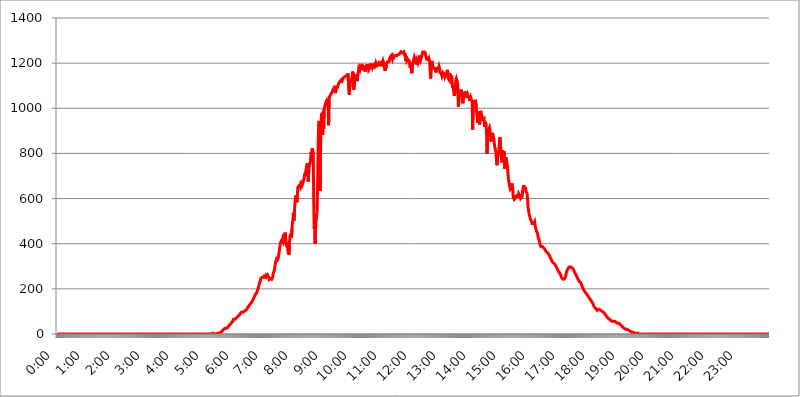
| Category | 2015.04.30. Intenzitás [W/m^2] |
|---|---|
| 0.0 | 0 |
| 0.0006944444444444445 | 0 |
| 0.001388888888888889 | 0 |
| 0.0020833333333333333 | 0 |
| 0.002777777777777778 | 0 |
| 0.003472222222222222 | 0 |
| 0.004166666666666667 | 0 |
| 0.004861111111111111 | 0 |
| 0.005555555555555556 | 0 |
| 0.0062499999999999995 | 0 |
| 0.006944444444444444 | 0 |
| 0.007638888888888889 | 0 |
| 0.008333333333333333 | 0 |
| 0.009027777777777779 | 0 |
| 0.009722222222222222 | 0 |
| 0.010416666666666666 | 0 |
| 0.011111111111111112 | 0 |
| 0.011805555555555555 | 0 |
| 0.012499999999999999 | 0 |
| 0.013194444444444444 | 0 |
| 0.013888888888888888 | 0 |
| 0.014583333333333332 | 0 |
| 0.015277777777777777 | 0 |
| 0.015972222222222224 | 0 |
| 0.016666666666666666 | 0 |
| 0.017361111111111112 | 0 |
| 0.018055555555555557 | 0 |
| 0.01875 | 0 |
| 0.019444444444444445 | 0 |
| 0.02013888888888889 | 0 |
| 0.020833333333333332 | 0 |
| 0.02152777777777778 | 0 |
| 0.022222222222222223 | 0 |
| 0.02291666666666667 | 0 |
| 0.02361111111111111 | 0 |
| 0.024305555555555556 | 0 |
| 0.024999999999999998 | 0 |
| 0.025694444444444447 | 0 |
| 0.02638888888888889 | 0 |
| 0.027083333333333334 | 0 |
| 0.027777777777777776 | 0 |
| 0.02847222222222222 | 0 |
| 0.029166666666666664 | 0 |
| 0.029861111111111113 | 0 |
| 0.030555555555555555 | 0 |
| 0.03125 | 0 |
| 0.03194444444444445 | 0 |
| 0.03263888888888889 | 0 |
| 0.03333333333333333 | 0 |
| 0.034027777777777775 | 0 |
| 0.034722222222222224 | 0 |
| 0.035416666666666666 | 0 |
| 0.036111111111111115 | 0 |
| 0.03680555555555556 | 0 |
| 0.0375 | 0 |
| 0.03819444444444444 | 0 |
| 0.03888888888888889 | 0 |
| 0.03958333333333333 | 0 |
| 0.04027777777777778 | 0 |
| 0.04097222222222222 | 0 |
| 0.041666666666666664 | 0 |
| 0.042361111111111106 | 0 |
| 0.04305555555555556 | 0 |
| 0.043750000000000004 | 0 |
| 0.044444444444444446 | 0 |
| 0.04513888888888889 | 0 |
| 0.04583333333333334 | 0 |
| 0.04652777777777778 | 0 |
| 0.04722222222222222 | 0 |
| 0.04791666666666666 | 0 |
| 0.04861111111111111 | 0 |
| 0.049305555555555554 | 0 |
| 0.049999999999999996 | 0 |
| 0.05069444444444445 | 0 |
| 0.051388888888888894 | 0 |
| 0.052083333333333336 | 0 |
| 0.05277777777777778 | 0 |
| 0.05347222222222222 | 0 |
| 0.05416666666666667 | 0 |
| 0.05486111111111111 | 0 |
| 0.05555555555555555 | 0 |
| 0.05625 | 0 |
| 0.05694444444444444 | 0 |
| 0.057638888888888885 | 0 |
| 0.05833333333333333 | 0 |
| 0.05902777777777778 | 0 |
| 0.059722222222222225 | 0 |
| 0.06041666666666667 | 0 |
| 0.061111111111111116 | 0 |
| 0.06180555555555556 | 0 |
| 0.0625 | 0 |
| 0.06319444444444444 | 0 |
| 0.06388888888888888 | 0 |
| 0.06458333333333334 | 0 |
| 0.06527777777777778 | 0 |
| 0.06597222222222222 | 0 |
| 0.06666666666666667 | 0 |
| 0.06736111111111111 | 0 |
| 0.06805555555555555 | 0 |
| 0.06874999999999999 | 0 |
| 0.06944444444444443 | 0 |
| 0.07013888888888889 | 0 |
| 0.07083333333333333 | 0 |
| 0.07152777777777779 | 0 |
| 0.07222222222222223 | 0 |
| 0.07291666666666667 | 0 |
| 0.07361111111111111 | 0 |
| 0.07430555555555556 | 0 |
| 0.075 | 0 |
| 0.07569444444444444 | 0 |
| 0.0763888888888889 | 0 |
| 0.07708333333333334 | 0 |
| 0.07777777777777778 | 0 |
| 0.07847222222222222 | 0 |
| 0.07916666666666666 | 0 |
| 0.0798611111111111 | 0 |
| 0.08055555555555556 | 0 |
| 0.08125 | 0 |
| 0.08194444444444444 | 0 |
| 0.08263888888888889 | 0 |
| 0.08333333333333333 | 0 |
| 0.08402777777777777 | 0 |
| 0.08472222222222221 | 0 |
| 0.08541666666666665 | 0 |
| 0.08611111111111112 | 0 |
| 0.08680555555555557 | 0 |
| 0.08750000000000001 | 0 |
| 0.08819444444444445 | 0 |
| 0.08888888888888889 | 0 |
| 0.08958333333333333 | 0 |
| 0.09027777777777778 | 0 |
| 0.09097222222222222 | 0 |
| 0.09166666666666667 | 0 |
| 0.09236111111111112 | 0 |
| 0.09305555555555556 | 0 |
| 0.09375 | 0 |
| 0.09444444444444444 | 0 |
| 0.09513888888888888 | 0 |
| 0.09583333333333333 | 0 |
| 0.09652777777777777 | 0 |
| 0.09722222222222222 | 0 |
| 0.09791666666666667 | 0 |
| 0.09861111111111111 | 0 |
| 0.09930555555555555 | 0 |
| 0.09999999999999999 | 0 |
| 0.10069444444444443 | 0 |
| 0.1013888888888889 | 0 |
| 0.10208333333333335 | 0 |
| 0.10277777777777779 | 0 |
| 0.10347222222222223 | 0 |
| 0.10416666666666667 | 0 |
| 0.10486111111111111 | 0 |
| 0.10555555555555556 | 0 |
| 0.10625 | 0 |
| 0.10694444444444444 | 0 |
| 0.1076388888888889 | 0 |
| 0.10833333333333334 | 0 |
| 0.10902777777777778 | 0 |
| 0.10972222222222222 | 0 |
| 0.1111111111111111 | 0 |
| 0.11180555555555556 | 0 |
| 0.11180555555555556 | 0 |
| 0.1125 | 0 |
| 0.11319444444444444 | 0 |
| 0.11388888888888889 | 0 |
| 0.11458333333333333 | 0 |
| 0.11527777777777777 | 0 |
| 0.11597222222222221 | 0 |
| 0.11666666666666665 | 0 |
| 0.1173611111111111 | 0 |
| 0.11805555555555557 | 0 |
| 0.11944444444444445 | 0 |
| 0.12013888888888889 | 0 |
| 0.12083333333333333 | 0 |
| 0.12152777777777778 | 0 |
| 0.12222222222222223 | 0 |
| 0.12291666666666667 | 0 |
| 0.12291666666666667 | 0 |
| 0.12361111111111112 | 0 |
| 0.12430555555555556 | 0 |
| 0.125 | 0 |
| 0.12569444444444444 | 0 |
| 0.12638888888888888 | 0 |
| 0.12708333333333333 | 0 |
| 0.16875 | 0 |
| 0.12847222222222224 | 0 |
| 0.12916666666666668 | 0 |
| 0.12986111111111112 | 0 |
| 0.13055555555555556 | 0 |
| 0.13125 | 0 |
| 0.13194444444444445 | 0 |
| 0.1326388888888889 | 0 |
| 0.13333333333333333 | 0 |
| 0.13402777777777777 | 0 |
| 0.13402777777777777 | 0 |
| 0.13472222222222222 | 0 |
| 0.13541666666666666 | 0 |
| 0.1361111111111111 | 0 |
| 0.13749999999999998 | 0 |
| 0.13819444444444443 | 0 |
| 0.1388888888888889 | 0 |
| 0.13958333333333334 | 0 |
| 0.14027777777777778 | 0 |
| 0.14097222222222222 | 0 |
| 0.14166666666666666 | 0 |
| 0.1423611111111111 | 0 |
| 0.14305555555555557 | 0 |
| 0.14375000000000002 | 0 |
| 0.14444444444444446 | 0 |
| 0.1451388888888889 | 0 |
| 0.1451388888888889 | 0 |
| 0.14652777777777778 | 0 |
| 0.14722222222222223 | 0 |
| 0.14791666666666667 | 0 |
| 0.1486111111111111 | 0 |
| 0.14930555555555555 | 0 |
| 0.15 | 0 |
| 0.15069444444444444 | 0 |
| 0.15138888888888888 | 0 |
| 0.15208333333333332 | 0 |
| 0.15277777777777776 | 0 |
| 0.15347222222222223 | 0 |
| 0.15416666666666667 | 0 |
| 0.15486111111111112 | 0 |
| 0.15555555555555556 | 0 |
| 0.15625 | 0 |
| 0.15694444444444444 | 0 |
| 0.15763888888888888 | 0 |
| 0.15833333333333333 | 0 |
| 0.15902777777777777 | 0 |
| 0.15972222222222224 | 0 |
| 0.16041666666666668 | 0 |
| 0.16111111111111112 | 0 |
| 0.16180555555555556 | 0 |
| 0.1625 | 0 |
| 0.16319444444444445 | 0 |
| 0.1638888888888889 | 0 |
| 0.16458333333333333 | 0 |
| 0.16527777777777777 | 0 |
| 0.16597222222222222 | 0 |
| 0.16666666666666666 | 0 |
| 0.1673611111111111 | 0 |
| 0.16805555555555554 | 0 |
| 0.16874999999999998 | 0 |
| 0.16944444444444443 | 0 |
| 0.17013888888888887 | 0 |
| 0.1708333333333333 | 0 |
| 0.17152777777777775 | 0 |
| 0.17222222222222225 | 0 |
| 0.1729166666666667 | 0 |
| 0.17361111111111113 | 0 |
| 0.17430555555555557 | 0 |
| 0.17500000000000002 | 0 |
| 0.17569444444444446 | 0 |
| 0.1763888888888889 | 0 |
| 0.17708333333333334 | 0 |
| 0.17777777777777778 | 0 |
| 0.17847222222222223 | 0 |
| 0.17916666666666667 | 0 |
| 0.1798611111111111 | 0 |
| 0.18055555555555555 | 0 |
| 0.18125 | 0 |
| 0.18194444444444444 | 0 |
| 0.1826388888888889 | 0 |
| 0.18333333333333335 | 0 |
| 0.1840277777777778 | 0 |
| 0.18472222222222223 | 0 |
| 0.18541666666666667 | 0 |
| 0.18611111111111112 | 0 |
| 0.18680555555555556 | 0 |
| 0.1875 | 0 |
| 0.18819444444444444 | 0 |
| 0.18888888888888888 | 0 |
| 0.18958333333333333 | 0 |
| 0.19027777777777777 | 0 |
| 0.1909722222222222 | 0 |
| 0.19166666666666665 | 0 |
| 0.19236111111111112 | 0 |
| 0.19305555555555554 | 0 |
| 0.19375 | 0 |
| 0.19444444444444445 | 0 |
| 0.1951388888888889 | 0 |
| 0.19583333333333333 | 0 |
| 0.19652777777777777 | 0 |
| 0.19722222222222222 | 0 |
| 0.19791666666666666 | 0 |
| 0.1986111111111111 | 0 |
| 0.19930555555555554 | 0 |
| 0.19999999999999998 | 0 |
| 0.20069444444444443 | 0 |
| 0.20138888888888887 | 0 |
| 0.2020833333333333 | 0 |
| 0.2027777777777778 | 0 |
| 0.2034722222222222 | 0 |
| 0.2041666666666667 | 0 |
| 0.20486111111111113 | 0 |
| 0.20555555555555557 | 0 |
| 0.20625000000000002 | 0 |
| 0.20694444444444446 | 0 |
| 0.2076388888888889 | 0 |
| 0.20833333333333334 | 0 |
| 0.20902777777777778 | 0 |
| 0.20972222222222223 | 0 |
| 0.21041666666666667 | 0 |
| 0.2111111111111111 | 0 |
| 0.21180555555555555 | 0 |
| 0.2125 | 0 |
| 0.21319444444444444 | 0 |
| 0.2138888888888889 | 0 |
| 0.21458333333333335 | 0 |
| 0.2152777777777778 | 0 |
| 0.21597222222222223 | 0 |
| 0.21666666666666667 | 0 |
| 0.21736111111111112 | 0 |
| 0.21805555555555556 | 3.525 |
| 0.21875 | 3.525 |
| 0.21944444444444444 | 0 |
| 0.22013888888888888 | 0 |
| 0.22083333333333333 | 0 |
| 0.22152777777777777 | 0 |
| 0.2222222222222222 | 0 |
| 0.22291666666666665 | 0 |
| 0.2236111111111111 | 3.525 |
| 0.22430555555555556 | 3.525 |
| 0.225 | 3.525 |
| 0.22569444444444445 | 3.525 |
| 0.2263888888888889 | 3.525 |
| 0.22708333333333333 | 3.525 |
| 0.22777777777777777 | 3.525 |
| 0.22847222222222222 | 7.887 |
| 0.22916666666666666 | 7.887 |
| 0.2298611111111111 | 12.257 |
| 0.23055555555555554 | 12.257 |
| 0.23124999999999998 | 12.257 |
| 0.23194444444444443 | 16.636 |
| 0.23263888888888887 | 16.636 |
| 0.2333333333333333 | 21.024 |
| 0.2340277777777778 | 21.024 |
| 0.2347222222222222 | 21.024 |
| 0.2354166666666667 | 25.419 |
| 0.23611111111111113 | 25.419 |
| 0.23680555555555557 | 25.419 |
| 0.23750000000000002 | 25.419 |
| 0.23819444444444446 | 29.823 |
| 0.2388888888888889 | 29.823 |
| 0.23958333333333334 | 29.823 |
| 0.24027777777777778 | 34.234 |
| 0.24097222222222223 | 38.653 |
| 0.24166666666666667 | 38.653 |
| 0.2423611111111111 | 38.653 |
| 0.24305555555555555 | 43.079 |
| 0.24375 | 47.511 |
| 0.24444444444444446 | 47.511 |
| 0.24513888888888888 | 51.951 |
| 0.24583333333333335 | 56.398 |
| 0.2465277777777778 | 56.398 |
| 0.24722222222222223 | 65.31 |
| 0.24791666666666667 | 65.31 |
| 0.24861111111111112 | 65.31 |
| 0.24930555555555556 | 65.31 |
| 0.25 | 65.31 |
| 0.25069444444444444 | 69.775 |
| 0.2513888888888889 | 69.775 |
| 0.2520833333333333 | 74.246 |
| 0.25277777777777777 | 74.246 |
| 0.2534722222222222 | 78.722 |
| 0.25416666666666665 | 78.722 |
| 0.2548611111111111 | 83.205 |
| 0.2555555555555556 | 83.205 |
| 0.25625000000000003 | 87.692 |
| 0.2569444444444445 | 92.184 |
| 0.2576388888888889 | 92.184 |
| 0.25833333333333336 | 96.682 |
| 0.2590277777777778 | 96.682 |
| 0.25972222222222224 | 96.682 |
| 0.2604166666666667 | 96.682 |
| 0.2611111111111111 | 96.682 |
| 0.26180555555555557 | 96.682 |
| 0.2625 | 101.184 |
| 0.26319444444444445 | 101.184 |
| 0.2638888888888889 | 101.184 |
| 0.26458333333333334 | 105.69 |
| 0.2652777777777778 | 105.69 |
| 0.2659722222222222 | 110.201 |
| 0.26666666666666666 | 110.201 |
| 0.2673611111111111 | 119.235 |
| 0.26805555555555555 | 119.235 |
| 0.26875 | 123.758 |
| 0.26944444444444443 | 128.284 |
| 0.2701388888888889 | 128.284 |
| 0.2708333333333333 | 132.814 |
| 0.27152777777777776 | 137.347 |
| 0.2722222222222222 | 137.347 |
| 0.27291666666666664 | 141.884 |
| 0.2736111111111111 | 146.423 |
| 0.2743055555555555 | 146.423 |
| 0.27499999999999997 | 155.509 |
| 0.27569444444444446 | 160.056 |
| 0.27638888888888885 | 164.605 |
| 0.27708333333333335 | 164.605 |
| 0.2777777777777778 | 173.709 |
| 0.27847222222222223 | 178.264 |
| 0.2791666666666667 | 178.264 |
| 0.2798611111111111 | 182.82 |
| 0.28055555555555556 | 191.937 |
| 0.28125 | 196.497 |
| 0.28194444444444444 | 205.62 |
| 0.2826388888888889 | 210.182 |
| 0.2833333333333333 | 223.873 |
| 0.28402777777777777 | 228.436 |
| 0.2847222222222222 | 233 |
| 0.28541666666666665 | 246.689 |
| 0.28611111111111115 | 246.689 |
| 0.28680555555555554 | 246.689 |
| 0.28750000000000003 | 251.251 |
| 0.2881944444444445 | 251.251 |
| 0.2888888888888889 | 251.251 |
| 0.28958333333333336 | 251.251 |
| 0.2902777777777778 | 255.813 |
| 0.29097222222222224 | 255.813 |
| 0.2916666666666667 | 255.813 |
| 0.2923611111111111 | 251.251 |
| 0.29305555555555557 | 260.373 |
| 0.29375 | 260.373 |
| 0.29444444444444445 | 255.813 |
| 0.2951388888888889 | 260.373 |
| 0.29583333333333334 | 255.813 |
| 0.2965277777777778 | 251.251 |
| 0.2972222222222222 | 242.127 |
| 0.29791666666666666 | 242.127 |
| 0.2986111111111111 | 246.689 |
| 0.29930555555555555 | 246.689 |
| 0.3 | 246.689 |
| 0.30069444444444443 | 242.127 |
| 0.3013888888888889 | 242.127 |
| 0.3020833333333333 | 251.251 |
| 0.30277777777777776 | 264.932 |
| 0.3034722222222222 | 274.047 |
| 0.30416666666666664 | 278.603 |
| 0.3048611111111111 | 287.709 |
| 0.3055555555555555 | 305.898 |
| 0.30624999999999997 | 319.517 |
| 0.3069444444444444 | 324.052 |
| 0.3076388888888889 | 333.113 |
| 0.30833333333333335 | 333.113 |
| 0.3090277777777778 | 328.584 |
| 0.30972222222222223 | 333.113 |
| 0.3104166666666667 | 346.682 |
| 0.3111111111111111 | 360.221 |
| 0.31180555555555556 | 378.224 |
| 0.3125 | 391.685 |
| 0.31319444444444444 | 405.108 |
| 0.3138888888888889 | 409.574 |
| 0.3145833333333333 | 409.574 |
| 0.31527777777777777 | 418.492 |
| 0.3159722222222222 | 414.035 |
| 0.31666666666666665 | 427.39 |
| 0.31736111111111115 | 440.702 |
| 0.31805555555555554 | 409.574 |
| 0.31875000000000003 | 414.035 |
| 0.3194444444444445 | 449.551 |
| 0.3201388888888889 | 436.27 |
| 0.32083333333333336 | 436.27 |
| 0.3215277777777778 | 391.685 |
| 0.32222222222222224 | 387.202 |
| 0.3229166666666667 | 391.685 |
| 0.3236111111111111 | 364.728 |
| 0.32430555555555557 | 360.221 |
| 0.325 | 351.198 |
| 0.32569444444444445 | 405.108 |
| 0.3263888888888889 | 431.833 |
| 0.32708333333333334 | 431.833 |
| 0.3277777777777778 | 445.129 |
| 0.3284722222222222 | 427.39 |
| 0.32916666666666666 | 462.786 |
| 0.3298611111111111 | 489.108 |
| 0.33055555555555555 | 506.542 |
| 0.33125 | 536.82 |
| 0.33194444444444443 | 502.192 |
| 0.3326388888888889 | 541.121 |
| 0.3333333333333333 | 545.416 |
| 0.3340277777777778 | 604.864 |
| 0.3347222222222222 | 613.252 |
| 0.3354166666666667 | 613.252 |
| 0.3361111111111111 | 583.779 |
| 0.3368055555555556 | 617.436 |
| 0.33749999999999997 | 650.667 |
| 0.33819444444444446 | 650.667 |
| 0.33888888888888885 | 650.667 |
| 0.33958333333333335 | 658.909 |
| 0.34027777777777773 | 663.019 |
| 0.34097222222222223 | 650.667 |
| 0.3416666666666666 | 663.019 |
| 0.3423611111111111 | 679.395 |
| 0.3430555555555555 | 675.311 |
| 0.34375 | 663.019 |
| 0.3444444444444445 | 667.123 |
| 0.3451388888888889 | 658.909 |
| 0.3458333333333334 | 683.473 |
| 0.34652777777777777 | 683.473 |
| 0.34722222222222227 | 711.832 |
| 0.34791666666666665 | 699.717 |
| 0.34861111111111115 | 719.877 |
| 0.34930555555555554 | 735.89 |
| 0.35000000000000003 | 731.896 |
| 0.3506944444444444 | 755.766 |
| 0.3513888888888889 | 719.877 |
| 0.3520833333333333 | 675.311 |
| 0.3527777777777778 | 731.896 |
| 0.3534722222222222 | 735.89 |
| 0.3541666666666667 | 751.803 |
| 0.3548611111111111 | 759.723 |
| 0.35555555555555557 | 783.342 |
| 0.35625 | 806.757 |
| 0.35694444444444445 | 771.559 |
| 0.3576388888888889 | 822.26 |
| 0.35833333333333334 | 818.392 |
| 0.3590277777777778 | 798.974 |
| 0.3597222222222222 | 596.45 |
| 0.36041666666666666 | 467.187 |
| 0.3611111111111111 | 493.475 |
| 0.36180555555555555 | 400.638 |
| 0.3625 | 480.356 |
| 0.36319444444444443 | 506.542 |
| 0.3638888888888889 | 506.542 |
| 0.3645833333333333 | 545.416 |
| 0.3652777777777778 | 541.121 |
| 0.3659722222222222 | 829.981 |
| 0.3666666666666667 | 936.33 |
| 0.3673611111111111 | 943.832 |
| 0.3680555555555556 | 925.06 |
| 0.36874999999999997 | 634.105 |
| 0.36944444444444446 | 872.114 |
| 0.37013888888888885 | 951.327 |
| 0.37083333333333335 | 977.508 |
| 0.37152777777777773 | 970.034 |
| 0.37222222222222223 | 883.516 |
| 0.3729166666666666 | 984.98 |
| 0.3736111111111111 | 909.996 |
| 0.3743055555555555 | 996.182 |
| 0.375 | 1003.65 |
| 0.3756944444444445 | 1014.852 |
| 0.3763888888888889 | 1022.323 |
| 0.3770833333333334 | 1026.06 |
| 0.37777777777777777 | 1033.537 |
| 0.37847222222222227 | 1033.537 |
| 0.37916666666666665 | 1026.06 |
| 0.37986111111111115 | 1014.852 |
| 0.38055555555555554 | 925.06 |
| 0.38125000000000003 | 1048.508 |
| 0.3819444444444444 | 1048.508 |
| 0.3826388888888889 | 1052.255 |
| 0.3833333333333333 | 1059.756 |
| 0.3840277777777778 | 1063.51 |
| 0.3847222222222222 | 1067.267 |
| 0.3854166666666667 | 1071.027 |
| 0.3861111111111111 | 1067.267 |
| 0.38680555555555557 | 1082.324 |
| 0.3875 | 1086.097 |
| 0.38819444444444445 | 1089.873 |
| 0.3888888888888889 | 1093.653 |
| 0.38958333333333334 | 1089.873 |
| 0.3902777777777778 | 1067.267 |
| 0.3909722222222222 | 1093.653 |
| 0.39166666666666666 | 1093.653 |
| 0.3923611111111111 | 1089.873 |
| 0.39305555555555555 | 1093.653 |
| 0.39375 | 1101.226 |
| 0.39444444444444443 | 1108.816 |
| 0.3951388888888889 | 1112.618 |
| 0.3958333333333333 | 1116.426 |
| 0.3965277777777778 | 1116.426 |
| 0.3972222222222222 | 1116.426 |
| 0.3979166666666667 | 1124.056 |
| 0.3986111111111111 | 1112.618 |
| 0.3993055555555556 | 1120.238 |
| 0.39999999999999997 | 1124.056 |
| 0.40069444444444446 | 1131.708 |
| 0.40138888888888885 | 1135.543 |
| 0.40208333333333335 | 1131.708 |
| 0.40277777777777773 | 1139.384 |
| 0.40347222222222223 | 1139.384 |
| 0.4041666666666666 | 1139.384 |
| 0.4048611111111111 | 1143.232 |
| 0.4055555555555555 | 1147.086 |
| 0.40625 | 1147.086 |
| 0.4069444444444445 | 1147.086 |
| 0.4076388888888889 | 1154.814 |
| 0.4083333333333334 | 1154.814 |
| 0.40902777777777777 | 1158.689 |
| 0.40972222222222227 | 1059.756 |
| 0.41041666666666665 | 1127.879 |
| 0.41111111111111115 | 1116.426 |
| 0.41180555555555554 | 1124.056 |
| 0.41250000000000003 | 1112.618 |
| 0.4131944444444444 | 1131.708 |
| 0.4138888888888889 | 1131.708 |
| 0.4145833333333333 | 1162.571 |
| 0.4152777777777778 | 1093.653 |
| 0.4159722222222222 | 1082.324 |
| 0.4166666666666667 | 1105.019 |
| 0.4173611111111111 | 1127.879 |
| 0.41805555555555557 | 1150.946 |
| 0.41875 | 1139.384 |
| 0.41944444444444445 | 1147.086 |
| 0.4201388888888889 | 1131.708 |
| 0.42083333333333334 | 1120.238 |
| 0.4215277777777778 | 1150.946 |
| 0.4222222222222222 | 1158.689 |
| 0.42291666666666666 | 1178.177 |
| 0.4236111111111111 | 1178.177 |
| 0.42430555555555555 | 1170.358 |
| 0.425 | 1186.03 |
| 0.42569444444444443 | 1186.03 |
| 0.4263888888888889 | 1189.969 |
| 0.4270833333333333 | 1178.177 |
| 0.4277777777777778 | 1189.969 |
| 0.4284722222222222 | 1189.969 |
| 0.4291666666666667 | 1186.03 |
| 0.4298611111111111 | 1186.03 |
| 0.4305555555555556 | 1189.969 |
| 0.43124999999999997 | 1189.969 |
| 0.43194444444444446 | 1162.571 |
| 0.43263888888888885 | 1174.263 |
| 0.43333333333333335 | 1182.099 |
| 0.43402777777777773 | 1189.969 |
| 0.43472222222222223 | 1189.969 |
| 0.4354166666666666 | 1193.918 |
| 0.4361111111111111 | 1189.969 |
| 0.4368055555555555 | 1170.358 |
| 0.4375 | 1170.358 |
| 0.4381944444444445 | 1178.177 |
| 0.4388888888888889 | 1197.876 |
| 0.4395833333333334 | 1178.177 |
| 0.44027777777777777 | 1193.918 |
| 0.44097222222222227 | 1197.876 |
| 0.44166666666666665 | 1182.099 |
| 0.44236111111111115 | 1182.099 |
| 0.44305555555555554 | 1197.876 |
| 0.44375000000000003 | 1174.263 |
| 0.4444444444444444 | 1178.177 |
| 0.4451388888888889 | 1189.969 |
| 0.4458333333333333 | 1193.918 |
| 0.4465277777777778 | 1201.843 |
| 0.4472222222222222 | 1193.918 |
| 0.4479166666666667 | 1182.099 |
| 0.4486111111111111 | 1193.918 |
| 0.44930555555555557 | 1189.969 |
| 0.45 | 1193.918 |
| 0.45069444444444445 | 1201.843 |
| 0.4513888888888889 | 1197.876 |
| 0.45208333333333334 | 1193.918 |
| 0.4527777777777778 | 1197.876 |
| 0.4534722222222222 | 1193.918 |
| 0.45416666666666666 | 1201.843 |
| 0.4548611111111111 | 1186.03 |
| 0.45555555555555555 | 1193.918 |
| 0.45625 | 1193.918 |
| 0.45694444444444443 | 1209.807 |
| 0.4576388888888889 | 1213.804 |
| 0.4583333333333333 | 1193.918 |
| 0.4590277777777778 | 1201.843 |
| 0.4597222222222222 | 1166.46 |
| 0.4604166666666667 | 1186.03 |
| 0.4611111111111111 | 1178.177 |
| 0.4618055555555556 | 1197.876 |
| 0.46249999999999997 | 1197.876 |
| 0.46319444444444446 | 1205.82 |
| 0.46388888888888885 | 1205.82 |
| 0.46458333333333335 | 1205.82 |
| 0.46527777777777773 | 1205.82 |
| 0.46597222222222223 | 1217.812 |
| 0.4666666666666666 | 1225.859 |
| 0.4673611111111111 | 1225.859 |
| 0.4680555555555555 | 1221.83 |
| 0.46875 | 1233.951 |
| 0.4694444444444445 | 1233.951 |
| 0.4701388888888889 | 1217.812 |
| 0.4708333333333334 | 1225.859 |
| 0.47152777777777777 | 1217.812 |
| 0.47222222222222227 | 1229.899 |
| 0.47291666666666665 | 1233.951 |
| 0.47361111111111115 | 1233.951 |
| 0.47430555555555554 | 1233.951 |
| 0.47500000000000003 | 1233.951 |
| 0.4756944444444444 | 1233.951 |
| 0.4763888888888889 | 1233.951 |
| 0.4770833333333333 | 1233.951 |
| 0.4777777777777778 | 1238.014 |
| 0.4784722222222222 | 1238.014 |
| 0.4791666666666667 | 1238.014 |
| 0.4798611111111111 | 1238.014 |
| 0.48055555555555557 | 1242.089 |
| 0.48125 | 1242.089 |
| 0.48194444444444445 | 1250.275 |
| 0.4826388888888889 | 1246.176 |
| 0.48333333333333334 | 1246.176 |
| 0.4840277777777778 | 1246.176 |
| 0.4847222222222222 | 1246.176 |
| 0.48541666666666666 | 1246.176 |
| 0.4861111111111111 | 1250.275 |
| 0.48680555555555555 | 1254.387 |
| 0.4875 | 1233.951 |
| 0.48819444444444443 | 1242.089 |
| 0.4888888888888889 | 1209.807 |
| 0.4895833333333333 | 1229.899 |
| 0.4902777777777778 | 1209.807 |
| 0.4909722222222222 | 1209.807 |
| 0.4916666666666667 | 1217.812 |
| 0.4923611111111111 | 1213.804 |
| 0.4930555555555556 | 1213.804 |
| 0.49374999999999997 | 1209.807 |
| 0.49444444444444446 | 1189.969 |
| 0.49513888888888885 | 1178.177 |
| 0.49583333333333335 | 1197.876 |
| 0.49652777777777773 | 1189.969 |
| 0.49722222222222223 | 1154.814 |
| 0.4979166666666666 | 1178.177 |
| 0.4986111111111111 | 1201.843 |
| 0.4993055555555555 | 1209.807 |
| 0.5 | 1209.807 |
| 0.5006944444444444 | 1225.859 |
| 0.5013888888888889 | 1217.812 |
| 0.5020833333333333 | 1209.807 |
| 0.5027777777777778 | 1209.807 |
| 0.5034722222222222 | 1217.812 |
| 0.5041666666666667 | 1193.918 |
| 0.5048611111111111 | 1221.83 |
| 0.5055555555555555 | 1225.859 |
| 0.50625 | 1201.843 |
| 0.5069444444444444 | 1205.82 |
| 0.5076388888888889 | 1213.804 |
| 0.5083333333333333 | 1233.951 |
| 0.5090277777777777 | 1221.83 |
| 0.5097222222222222 | 1213.804 |
| 0.5104166666666666 | 1221.83 |
| 0.5111111111111112 | 1229.899 |
| 0.5118055555555555 | 1225.859 |
| 0.5125000000000001 | 1246.176 |
| 0.5131944444444444 | 1254.387 |
| 0.513888888888889 | 1246.176 |
| 0.5145833333333333 | 1250.275 |
| 0.5152777777777778 | 1242.089 |
| 0.5159722222222222 | 1246.176 |
| 0.5166666666666667 | 1233.951 |
| 0.517361111111111 | 1233.951 |
| 0.5180555555555556 | 1217.812 |
| 0.5187499999999999 | 1221.83 |
| 0.5194444444444445 | 1217.812 |
| 0.5201388888888888 | 1221.83 |
| 0.5208333333333334 | 1209.807 |
| 0.5215277777777778 | 1217.812 |
| 0.5222222222222223 | 1209.807 |
| 0.5229166666666667 | 1209.807 |
| 0.5236111111111111 | 1131.708 |
| 0.5243055555555556 | 1174.263 |
| 0.525 | 1201.843 |
| 0.5256944444444445 | 1209.807 |
| 0.5263888888888889 | 1186.03 |
| 0.5270833333333333 | 1189.969 |
| 0.5277777777777778 | 1186.03 |
| 0.5284722222222222 | 1178.177 |
| 0.5291666666666667 | 1174.263 |
| 0.5298611111111111 | 1174.263 |
| 0.5305555555555556 | 1166.46 |
| 0.53125 | 1158.689 |
| 0.5319444444444444 | 1182.099 |
| 0.5326388888888889 | 1174.263 |
| 0.5333333333333333 | 1178.177 |
| 0.5340277777777778 | 1174.263 |
| 0.5347222222222222 | 1178.177 |
| 0.5354166666666667 | 1186.03 |
| 0.5361111111111111 | 1178.177 |
| 0.5368055555555555 | 1158.689 |
| 0.5375 | 1154.814 |
| 0.5381944444444444 | 1162.571 |
| 0.5388888888888889 | 1150.946 |
| 0.5395833333333333 | 1143.232 |
| 0.5402777777777777 | 1147.086 |
| 0.5409722222222222 | 1158.689 |
| 0.5416666666666666 | 1154.814 |
| 0.5423611111111112 | 1162.571 |
| 0.5430555555555555 | 1150.946 |
| 0.5437500000000001 | 1139.384 |
| 0.5444444444444444 | 1139.384 |
| 0.545138888888889 | 1139.384 |
| 0.5458333333333333 | 1154.814 |
| 0.5465277777777778 | 1154.814 |
| 0.5472222222222222 | 1170.358 |
| 0.5479166666666667 | 1166.46 |
| 0.548611111111111 | 1131.708 |
| 0.5493055555555556 | 1131.708 |
| 0.5499999999999999 | 1124.056 |
| 0.5506944444444445 | 1154.814 |
| 0.5513888888888888 | 1139.384 |
| 0.5520833333333334 | 1143.232 |
| 0.5527777777777778 | 1139.384 |
| 0.5534722222222223 | 1139.384 |
| 0.5541666666666667 | 1097.437 |
| 0.5548611111111111 | 1089.873 |
| 0.5555555555555556 | 1101.226 |
| 0.55625 | 1105.019 |
| 0.5569444444444445 | 1056.004 |
| 0.5576388888888889 | 1067.267 |
| 0.5583333333333333 | 1067.267 |
| 0.5590277777777778 | 1124.056 |
| 0.5597222222222222 | 1131.708 |
| 0.5604166666666667 | 1127.879 |
| 0.5611111111111111 | 1116.426 |
| 0.5618055555555556 | 1101.226 |
| 0.5625 | 1007.383 |
| 0.5631944444444444 | 1022.323 |
| 0.5638888888888889 | 1074.789 |
| 0.5645833333333333 | 1078.555 |
| 0.5652777777777778 | 1078.555 |
| 0.5659722222222222 | 1074.789 |
| 0.5666666666666667 | 1082.324 |
| 0.5673611111111111 | 1082.324 |
| 0.5680555555555555 | 1082.324 |
| 0.56875 | 1022.323 |
| 0.5694444444444444 | 1033.537 |
| 0.5701388888888889 | 1056.004 |
| 0.5708333333333333 | 1059.756 |
| 0.5715277777777777 | 1067.267 |
| 0.5722222222222222 | 1074.789 |
| 0.5729166666666666 | 1052.255 |
| 0.5736111111111112 | 1052.255 |
| 0.5743055555555555 | 1048.508 |
| 0.5750000000000001 | 1052.255 |
| 0.5756944444444444 | 1059.756 |
| 0.576388888888889 | 1056.004 |
| 0.5770833333333333 | 1044.762 |
| 0.5777777777777778 | 1056.004 |
| 0.5784722222222222 | 1033.537 |
| 0.5791666666666667 | 1037.277 |
| 0.579861111111111 | 1048.508 |
| 0.5805555555555556 | 1041.019 |
| 0.5812499999999999 | 1041.019 |
| 0.5819444444444445 | 1029.798 |
| 0.5826388888888888 | 906.223 |
| 0.5833333333333334 | 1007.383 |
| 0.5840277777777778 | 1026.06 |
| 0.5847222222222223 | 1029.798 |
| 0.5854166666666667 | 1014.852 |
| 0.5861111111111111 | 1037.277 |
| 0.5868055555555556 | 1029.798 |
| 0.5875 | 1018.587 |
| 0.5881944444444445 | 973.772 |
| 0.5888888888888889 | 984.98 |
| 0.5895833333333333 | 936.33 |
| 0.5902777777777778 | 977.508 |
| 0.5909722222222222 | 984.98 |
| 0.5916666666666667 | 984.98 |
| 0.5923611111111111 | 928.819 |
| 0.5930555555555556 | 977.508 |
| 0.59375 | 988.714 |
| 0.5944444444444444 | 981.244 |
| 0.5951388888888889 | 981.244 |
| 0.5958333333333333 | 977.508 |
| 0.5965277777777778 | 951.327 |
| 0.5972222222222222 | 951.327 |
| 0.5979166666666667 | 955.071 |
| 0.5986111111111111 | 955.071 |
| 0.5993055555555555 | 917.534 |
| 0.6 | 932.576 |
| 0.6006944444444444 | 940.082 |
| 0.6013888888888889 | 921.298 |
| 0.6020833333333333 | 902.447 |
| 0.6027777777777777 | 798.974 |
| 0.6034722222222222 | 875.918 |
| 0.6041666666666666 | 909.996 |
| 0.6048611111111112 | 902.447 |
| 0.6055555555555555 | 906.223 |
| 0.6062500000000001 | 913.766 |
| 0.6069444444444444 | 902.447 |
| 0.607638888888889 | 883.516 |
| 0.6083333333333333 | 853.029 |
| 0.6090277777777778 | 868.305 |
| 0.6097222222222222 | 875.918 |
| 0.6104166666666667 | 891.099 |
| 0.611111111111111 | 879.719 |
| 0.6118055555555556 | 879.719 |
| 0.6124999999999999 | 860.676 |
| 0.6131944444444445 | 837.682 |
| 0.6138888888888888 | 837.682 |
| 0.6145833333333334 | 814.519 |
| 0.6152777777777778 | 806.757 |
| 0.6159722222222223 | 775.492 |
| 0.6166666666666667 | 747.834 |
| 0.6173611111111111 | 775.492 |
| 0.6180555555555556 | 791.169 |
| 0.61875 | 798.974 |
| 0.6194444444444445 | 818.392 |
| 0.6201388888888889 | 841.526 |
| 0.6208333333333333 | 872.114 |
| 0.6215277777777778 | 868.305 |
| 0.6222222222222222 | 810.641 |
| 0.6229166666666667 | 791.169 |
| 0.6236111111111111 | 759.723 |
| 0.6243055555555556 | 814.519 |
| 0.625 | 798.974 |
| 0.6256944444444444 | 775.492 |
| 0.6263888888888889 | 810.641 |
| 0.6270833333333333 | 787.258 |
| 0.6277777777777778 | 731.896 |
| 0.6284722222222222 | 775.492 |
| 0.6291666666666667 | 783.342 |
| 0.6298611111111111 | 783.342 |
| 0.6305555555555555 | 787.258 |
| 0.63125 | 743.859 |
| 0.6319444444444444 | 739.877 |
| 0.6326388888888889 | 691.608 |
| 0.6333333333333333 | 675.311 |
| 0.6340277777777777 | 671.22 |
| 0.6347222222222222 | 650.667 |
| 0.6354166666666666 | 642.4 |
| 0.6361111111111112 | 642.4 |
| 0.6368055555555555 | 650.667 |
| 0.6375000000000001 | 667.123 |
| 0.6381944444444444 | 667.123 |
| 0.638888888888889 | 642.4 |
| 0.6395833333333333 | 604.864 |
| 0.6402777777777778 | 600.661 |
| 0.6409722222222222 | 596.45 |
| 0.6416666666666667 | 596.45 |
| 0.642361111111111 | 596.45 |
| 0.6430555555555556 | 604.864 |
| 0.6437499999999999 | 604.864 |
| 0.6444444444444445 | 613.252 |
| 0.6451388888888888 | 613.252 |
| 0.6458333333333334 | 613.252 |
| 0.6465277777777778 | 609.062 |
| 0.6472222222222223 | 621.613 |
| 0.6479166666666667 | 617.436 |
| 0.6486111111111111 | 617.436 |
| 0.6493055555555556 | 609.062 |
| 0.65 | 600.661 |
| 0.6506944444444445 | 600.661 |
| 0.6513888888888889 | 600.661 |
| 0.6520833333333333 | 609.062 |
| 0.6527777777777778 | 634.105 |
| 0.6534722222222222 | 650.667 |
| 0.6541666666666667 | 658.909 |
| 0.6548611111111111 | 658.909 |
| 0.6555555555555556 | 642.4 |
| 0.65625 | 650.667 |
| 0.6569444444444444 | 642.4 |
| 0.6576388888888889 | 629.948 |
| 0.6583333333333333 | 629.948 |
| 0.6590277777777778 | 621.613 |
| 0.6597222222222222 | 592.233 |
| 0.6604166666666667 | 558.261 |
| 0.6611111111111111 | 545.416 |
| 0.6618055555555555 | 532.513 |
| 0.6625 | 523.88 |
| 0.6631944444444444 | 519.555 |
| 0.6638888888888889 | 506.542 |
| 0.6645833333333333 | 502.192 |
| 0.6652777777777777 | 497.836 |
| 0.6659722222222222 | 489.108 |
| 0.6666666666666666 | 489.108 |
| 0.6673611111111111 | 489.108 |
| 0.6680555555555556 | 489.108 |
| 0.6687500000000001 | 489.108 |
| 0.6694444444444444 | 497.836 |
| 0.6701388888888888 | 480.356 |
| 0.6708333333333334 | 471.582 |
| 0.6715277777777778 | 462.786 |
| 0.6722222222222222 | 453.968 |
| 0.6729166666666666 | 458.38 |
| 0.6736111111111112 | 445.129 |
| 0.6743055555555556 | 431.833 |
| 0.6749999999999999 | 422.943 |
| 0.6756944444444444 | 418.492 |
| 0.6763888888888889 | 405.108 |
| 0.6770833333333334 | 396.164 |
| 0.6777777777777777 | 391.685 |
| 0.6784722222222223 | 387.202 |
| 0.6791666666666667 | 387.202 |
| 0.6798611111111111 | 387.202 |
| 0.6805555555555555 | 387.202 |
| 0.68125 | 387.202 |
| 0.6819444444444445 | 382.715 |
| 0.6826388888888889 | 382.715 |
| 0.6833333333333332 | 378.224 |
| 0.6840277777777778 | 373.729 |
| 0.6847222222222222 | 369.23 |
| 0.6854166666666667 | 369.23 |
| 0.686111111111111 | 364.728 |
| 0.6868055555555556 | 364.728 |
| 0.6875 | 360.221 |
| 0.6881944444444444 | 360.221 |
| 0.688888888888889 | 355.712 |
| 0.6895833333333333 | 351.198 |
| 0.6902777777777778 | 346.682 |
| 0.6909722222222222 | 342.162 |
| 0.6916666666666668 | 337.639 |
| 0.6923611111111111 | 333.113 |
| 0.6930555555555555 | 328.584 |
| 0.69375 | 324.052 |
| 0.6944444444444445 | 319.517 |
| 0.6951388888888889 | 319.517 |
| 0.6958333333333333 | 314.98 |
| 0.6965277777777777 | 314.98 |
| 0.6972222222222223 | 310.44 |
| 0.6979166666666666 | 310.44 |
| 0.6986111111111111 | 305.898 |
| 0.6993055555555556 | 301.354 |
| 0.7000000000000001 | 296.808 |
| 0.7006944444444444 | 292.259 |
| 0.7013888888888888 | 287.709 |
| 0.7020833333333334 | 287.709 |
| 0.7027777777777778 | 278.603 |
| 0.7034722222222222 | 274.047 |
| 0.7041666666666666 | 274.047 |
| 0.7048611111111112 | 269.49 |
| 0.7055555555555556 | 264.932 |
| 0.7062499999999999 | 260.373 |
| 0.7069444444444444 | 251.251 |
| 0.7076388888888889 | 251.251 |
| 0.7083333333333334 | 246.689 |
| 0.7090277777777777 | 246.689 |
| 0.7097222222222223 | 242.127 |
| 0.7104166666666667 | 242.127 |
| 0.7111111111111111 | 242.127 |
| 0.7118055555555555 | 246.689 |
| 0.7125 | 251.251 |
| 0.7131944444444445 | 260.373 |
| 0.7138888888888889 | 269.49 |
| 0.7145833333333332 | 278.603 |
| 0.7152777777777778 | 283.156 |
| 0.7159722222222222 | 287.709 |
| 0.7166666666666667 | 292.259 |
| 0.717361111111111 | 292.259 |
| 0.7180555555555556 | 296.808 |
| 0.71875 | 296.808 |
| 0.7194444444444444 | 296.808 |
| 0.720138888888889 | 296.808 |
| 0.7208333333333333 | 296.808 |
| 0.7215277777777778 | 296.808 |
| 0.7222222222222222 | 292.259 |
| 0.7229166666666668 | 292.259 |
| 0.7236111111111111 | 287.709 |
| 0.7243055555555555 | 283.156 |
| 0.725 | 278.603 |
| 0.7256944444444445 | 274.047 |
| 0.7263888888888889 | 269.49 |
| 0.7270833333333333 | 264.932 |
| 0.7277777777777777 | 260.373 |
| 0.7284722222222223 | 255.813 |
| 0.7291666666666666 | 251.251 |
| 0.7298611111111111 | 246.689 |
| 0.7305555555555556 | 242.127 |
| 0.7312500000000001 | 237.564 |
| 0.7319444444444444 | 233 |
| 0.7326388888888888 | 233 |
| 0.7333333333333334 | 233 |
| 0.7340277777777778 | 228.436 |
| 0.7347222222222222 | 223.873 |
| 0.7354166666666666 | 219.309 |
| 0.7361111111111112 | 210.182 |
| 0.7368055555555556 | 205.62 |
| 0.7374999999999999 | 201.058 |
| 0.7381944444444444 | 196.497 |
| 0.7388888888888889 | 191.937 |
| 0.7395833333333334 | 191.937 |
| 0.7402777777777777 | 187.378 |
| 0.7409722222222223 | 182.82 |
| 0.7416666666666667 | 182.82 |
| 0.7423611111111111 | 178.264 |
| 0.7430555555555555 | 173.709 |
| 0.74375 | 173.709 |
| 0.7444444444444445 | 169.156 |
| 0.7451388888888889 | 164.605 |
| 0.7458333333333332 | 160.056 |
| 0.7465277777777778 | 160.056 |
| 0.7472222222222222 | 155.509 |
| 0.7479166666666667 | 155.509 |
| 0.748611111111111 | 146.423 |
| 0.7493055555555556 | 146.423 |
| 0.75 | 141.884 |
| 0.7506944444444444 | 137.347 |
| 0.751388888888889 | 132.814 |
| 0.7520833333333333 | 128.284 |
| 0.7527777777777778 | 123.758 |
| 0.7534722222222222 | 119.235 |
| 0.7541666666666668 | 119.235 |
| 0.7548611111111111 | 114.716 |
| 0.7555555555555555 | 110.201 |
| 0.75625 | 110.201 |
| 0.7569444444444445 | 105.69 |
| 0.7576388888888889 | 110.201 |
| 0.7583333333333333 | 110.201 |
| 0.7590277777777777 | 110.201 |
| 0.7597222222222223 | 110.201 |
| 0.7604166666666666 | 110.201 |
| 0.7611111111111111 | 110.201 |
| 0.7618055555555556 | 105.69 |
| 0.7625000000000001 | 105.69 |
| 0.7631944444444444 | 105.69 |
| 0.7638888888888888 | 101.184 |
| 0.7645833333333334 | 101.184 |
| 0.7652777777777778 | 101.184 |
| 0.7659722222222222 | 96.682 |
| 0.7666666666666666 | 96.682 |
| 0.7673611111111112 | 92.184 |
| 0.7680555555555556 | 87.692 |
| 0.7687499999999999 | 87.692 |
| 0.7694444444444444 | 83.205 |
| 0.7701388888888889 | 78.722 |
| 0.7708333333333334 | 78.722 |
| 0.7715277777777777 | 74.246 |
| 0.7722222222222223 | 74.246 |
| 0.7729166666666667 | 69.775 |
| 0.7736111111111111 | 69.775 |
| 0.7743055555555555 | 65.31 |
| 0.775 | 65.31 |
| 0.7756944444444445 | 65.31 |
| 0.7763888888888889 | 60.85 |
| 0.7770833333333332 | 60.85 |
| 0.7777777777777778 | 56.398 |
| 0.7784722222222222 | 56.398 |
| 0.7791666666666667 | 56.398 |
| 0.779861111111111 | 56.398 |
| 0.7805555555555556 | 56.398 |
| 0.78125 | 56.398 |
| 0.7819444444444444 | 56.398 |
| 0.782638888888889 | 56.398 |
| 0.7833333333333333 | 56.398 |
| 0.7840277777777778 | 51.951 |
| 0.7847222222222222 | 51.951 |
| 0.7854166666666668 | 51.951 |
| 0.7861111111111111 | 47.511 |
| 0.7868055555555555 | 47.511 |
| 0.7875 | 47.511 |
| 0.7881944444444445 | 47.511 |
| 0.7888888888888889 | 43.079 |
| 0.7895833333333333 | 43.079 |
| 0.7902777777777777 | 38.653 |
| 0.7909722222222223 | 38.653 |
| 0.7916666666666666 | 34.234 |
| 0.7923611111111111 | 34.234 |
| 0.7930555555555556 | 29.823 |
| 0.7937500000000001 | 29.823 |
| 0.7944444444444444 | 29.823 |
| 0.7951388888888888 | 25.419 |
| 0.7958333333333334 | 25.419 |
| 0.7965277777777778 | 25.419 |
| 0.7972222222222222 | 21.024 |
| 0.7979166666666666 | 21.024 |
| 0.7986111111111112 | 21.024 |
| 0.7993055555555556 | 21.024 |
| 0.7999999999999999 | 16.636 |
| 0.8006944444444444 | 16.636 |
| 0.8013888888888889 | 16.636 |
| 0.8020833333333334 | 16.636 |
| 0.8027777777777777 | 12.257 |
| 0.8034722222222223 | 12.257 |
| 0.8041666666666667 | 12.257 |
| 0.8048611111111111 | 12.257 |
| 0.8055555555555555 | 7.887 |
| 0.80625 | 7.887 |
| 0.8069444444444445 | 7.887 |
| 0.8076388888888889 | 7.887 |
| 0.8083333333333332 | 7.887 |
| 0.8090277777777778 | 3.525 |
| 0.8097222222222222 | 3.525 |
| 0.8104166666666667 | 3.525 |
| 0.811111111111111 | 3.525 |
| 0.8118055555555556 | 3.525 |
| 0.8125 | 3.525 |
| 0.8131944444444444 | 3.525 |
| 0.813888888888889 | 3.525 |
| 0.8145833333333333 | 3.525 |
| 0.8152777777777778 | 0 |
| 0.8159722222222222 | 0 |
| 0.8166666666666668 | 0 |
| 0.8173611111111111 | 0 |
| 0.8180555555555555 | 0 |
| 0.81875 | 0 |
| 0.8194444444444445 | 0 |
| 0.8201388888888889 | 0 |
| 0.8208333333333333 | 0 |
| 0.8215277777777777 | 0 |
| 0.8222222222222223 | 0 |
| 0.8229166666666666 | 0 |
| 0.8236111111111111 | 0 |
| 0.8243055555555556 | 0 |
| 0.8250000000000001 | 0 |
| 0.8256944444444444 | 0 |
| 0.8263888888888888 | 0 |
| 0.8270833333333334 | 0 |
| 0.8277777777777778 | 0 |
| 0.8284722222222222 | 0 |
| 0.8291666666666666 | 0 |
| 0.8298611111111112 | 0 |
| 0.8305555555555556 | 0 |
| 0.8312499999999999 | 0 |
| 0.8319444444444444 | 0 |
| 0.8326388888888889 | 0 |
| 0.8333333333333334 | 0 |
| 0.8340277777777777 | 0 |
| 0.8347222222222223 | 0 |
| 0.8354166666666667 | 0 |
| 0.8361111111111111 | 0 |
| 0.8368055555555555 | 0 |
| 0.8375 | 0 |
| 0.8381944444444445 | 0 |
| 0.8388888888888889 | 0 |
| 0.8395833333333332 | 0 |
| 0.8402777777777778 | 0 |
| 0.8409722222222222 | 0 |
| 0.8416666666666667 | 0 |
| 0.842361111111111 | 0 |
| 0.8430555555555556 | 0 |
| 0.84375 | 0 |
| 0.8444444444444444 | 0 |
| 0.845138888888889 | 0 |
| 0.8458333333333333 | 0 |
| 0.8465277777777778 | 0 |
| 0.8472222222222222 | 0 |
| 0.8479166666666668 | 0 |
| 0.8486111111111111 | 0 |
| 0.8493055555555555 | 0 |
| 0.85 | 0 |
| 0.8506944444444445 | 0 |
| 0.8513888888888889 | 0 |
| 0.8520833333333333 | 0 |
| 0.8527777777777777 | 0 |
| 0.8534722222222223 | 0 |
| 0.8541666666666666 | 0 |
| 0.8548611111111111 | 0 |
| 0.8555555555555556 | 0 |
| 0.8562500000000001 | 0 |
| 0.8569444444444444 | 0 |
| 0.8576388888888888 | 0 |
| 0.8583333333333334 | 0 |
| 0.8590277777777778 | 0 |
| 0.8597222222222222 | 0 |
| 0.8604166666666666 | 0 |
| 0.8611111111111112 | 0 |
| 0.8618055555555556 | 0 |
| 0.8624999999999999 | 0 |
| 0.8631944444444444 | 0 |
| 0.8638888888888889 | 0 |
| 0.8645833333333334 | 0 |
| 0.8652777777777777 | 0 |
| 0.8659722222222223 | 0 |
| 0.8666666666666667 | 0 |
| 0.8673611111111111 | 0 |
| 0.8680555555555555 | 0 |
| 0.86875 | 0 |
| 0.8694444444444445 | 0 |
| 0.8701388888888889 | 0 |
| 0.8708333333333332 | 0 |
| 0.8715277777777778 | 0 |
| 0.8722222222222222 | 0 |
| 0.8729166666666667 | 0 |
| 0.873611111111111 | 0 |
| 0.8743055555555556 | 0 |
| 0.875 | 0 |
| 0.8756944444444444 | 0 |
| 0.876388888888889 | 0 |
| 0.8770833333333333 | 0 |
| 0.8777777777777778 | 0 |
| 0.8784722222222222 | 0 |
| 0.8791666666666668 | 0 |
| 0.8798611111111111 | 0 |
| 0.8805555555555555 | 0 |
| 0.88125 | 0 |
| 0.8819444444444445 | 0 |
| 0.8826388888888889 | 0 |
| 0.8833333333333333 | 0 |
| 0.8840277777777777 | 0 |
| 0.8847222222222223 | 0 |
| 0.8854166666666666 | 0 |
| 0.8861111111111111 | 0 |
| 0.8868055555555556 | 0 |
| 0.8875000000000001 | 0 |
| 0.8881944444444444 | 0 |
| 0.8888888888888888 | 0 |
| 0.8895833333333334 | 0 |
| 0.8902777777777778 | 0 |
| 0.8909722222222222 | 0 |
| 0.8916666666666666 | 0 |
| 0.8923611111111112 | 0 |
| 0.8930555555555556 | 0 |
| 0.8937499999999999 | 0 |
| 0.8944444444444444 | 0 |
| 0.8951388888888889 | 0 |
| 0.8958333333333334 | 0 |
| 0.8965277777777777 | 0 |
| 0.8972222222222223 | 0 |
| 0.8979166666666667 | 0 |
| 0.8986111111111111 | 0 |
| 0.8993055555555555 | 0 |
| 0.9 | 0 |
| 0.9006944444444445 | 0 |
| 0.9013888888888889 | 0 |
| 0.9020833333333332 | 0 |
| 0.9027777777777778 | 0 |
| 0.9034722222222222 | 0 |
| 0.9041666666666667 | 0 |
| 0.904861111111111 | 0 |
| 0.9055555555555556 | 0 |
| 0.90625 | 0 |
| 0.9069444444444444 | 0 |
| 0.907638888888889 | 0 |
| 0.9083333333333333 | 0 |
| 0.9090277777777778 | 0 |
| 0.9097222222222222 | 0 |
| 0.9104166666666668 | 0 |
| 0.9111111111111111 | 0 |
| 0.9118055555555555 | 0 |
| 0.9125 | 0 |
| 0.9131944444444445 | 0 |
| 0.9138888888888889 | 0 |
| 0.9145833333333333 | 0 |
| 0.9152777777777777 | 0 |
| 0.9159722222222223 | 0 |
| 0.9166666666666666 | 0 |
| 0.9173611111111111 | 0 |
| 0.9180555555555556 | 0 |
| 0.9187500000000001 | 0 |
| 0.9194444444444444 | 0 |
| 0.9201388888888888 | 0 |
| 0.9208333333333334 | 0 |
| 0.9215277777777778 | 0 |
| 0.9222222222222222 | 0 |
| 0.9229166666666666 | 0 |
| 0.9236111111111112 | 0 |
| 0.9243055555555556 | 0 |
| 0.9249999999999999 | 0 |
| 0.9256944444444444 | 0 |
| 0.9263888888888889 | 0 |
| 0.9270833333333334 | 0 |
| 0.9277777777777777 | 0 |
| 0.9284722222222223 | 0 |
| 0.9291666666666667 | 0 |
| 0.9298611111111111 | 0 |
| 0.9305555555555555 | 0 |
| 0.93125 | 0 |
| 0.9319444444444445 | 0 |
| 0.9326388888888889 | 0 |
| 0.9333333333333332 | 0 |
| 0.9340277777777778 | 0 |
| 0.9347222222222222 | 0 |
| 0.9354166666666667 | 0 |
| 0.936111111111111 | 0 |
| 0.9368055555555556 | 0 |
| 0.9375 | 0 |
| 0.9381944444444444 | 0 |
| 0.938888888888889 | 0 |
| 0.9395833333333333 | 0 |
| 0.9402777777777778 | 0 |
| 0.9409722222222222 | 0 |
| 0.9416666666666668 | 0 |
| 0.9423611111111111 | 0 |
| 0.9430555555555555 | 0 |
| 0.94375 | 0 |
| 0.9444444444444445 | 0 |
| 0.9451388888888889 | 0 |
| 0.9458333333333333 | 0 |
| 0.9465277777777777 | 0 |
| 0.9472222222222223 | 0 |
| 0.9479166666666666 | 0 |
| 0.9486111111111111 | 0 |
| 0.9493055555555556 | 0 |
| 0.9500000000000001 | 0 |
| 0.9506944444444444 | 0 |
| 0.9513888888888888 | 0 |
| 0.9520833333333334 | 0 |
| 0.9527777777777778 | 0 |
| 0.9534722222222222 | 0 |
| 0.9541666666666666 | 0 |
| 0.9548611111111112 | 0 |
| 0.9555555555555556 | 0 |
| 0.9562499999999999 | 0 |
| 0.9569444444444444 | 0 |
| 0.9576388888888889 | 0 |
| 0.9583333333333334 | 0 |
| 0.9590277777777777 | 0 |
| 0.9597222222222223 | 0 |
| 0.9604166666666667 | 0 |
| 0.9611111111111111 | 0 |
| 0.9618055555555555 | 0 |
| 0.9625 | 0 |
| 0.9631944444444445 | 0 |
| 0.9638888888888889 | 0 |
| 0.9645833333333332 | 0 |
| 0.9652777777777778 | 0 |
| 0.9659722222222222 | 0 |
| 0.9666666666666667 | 0 |
| 0.967361111111111 | 0 |
| 0.9680555555555556 | 0 |
| 0.96875 | 0 |
| 0.9694444444444444 | 0 |
| 0.970138888888889 | 0 |
| 0.9708333333333333 | 0 |
| 0.9715277777777778 | 0 |
| 0.9722222222222222 | 0 |
| 0.9729166666666668 | 0 |
| 0.9736111111111111 | 0 |
| 0.9743055555555555 | 0 |
| 0.975 | 0 |
| 0.9756944444444445 | 0 |
| 0.9763888888888889 | 0 |
| 0.9770833333333333 | 0 |
| 0.9777777777777777 | 0 |
| 0.9784722222222223 | 0 |
| 0.9791666666666666 | 0 |
| 0.9798611111111111 | 0 |
| 0.9805555555555556 | 0 |
| 0.9812500000000001 | 0 |
| 0.9819444444444444 | 0 |
| 0.9826388888888888 | 0 |
| 0.9833333333333334 | 0 |
| 0.9840277777777778 | 0 |
| 0.9847222222222222 | 0 |
| 0.9854166666666666 | 0 |
| 0.9861111111111112 | 0 |
| 0.9868055555555556 | 0 |
| 0.9874999999999999 | 0 |
| 0.9881944444444444 | 0 |
| 0.9888888888888889 | 0 |
| 0.9895833333333334 | 0 |
| 0.9902777777777777 | 0 |
| 0.9909722222222223 | 0 |
| 0.9916666666666667 | 0 |
| 0.9923611111111111 | 0 |
| 0.9930555555555555 | 0 |
| 0.99375 | 0 |
| 0.9944444444444445 | 0 |
| 0.9951388888888889 | 0 |
| 0.9958333333333332 | 0 |
| 0.9965277777777778 | 0 |
| 0.9972222222222222 | 0 |
| 0.9979166666666667 | 0 |
| 0.998611111111111 | 0 |
| 0.9993055555555556 | 0 |